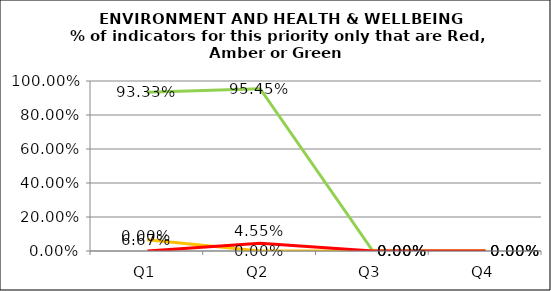
| Category | Green | Amber | Red |
|---|---|---|---|
| Q1 | 0.933 | 0.067 | 0 |
| Q2 | 0.955 | 0 | 0.045 |
| Q3 | 0 | 0 | 0 |
| Q4 | 0 | 0 | 0 |